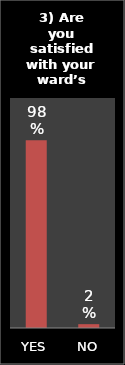
| Category | Series 0 |
|---|---|
| YES | 0.98 |
| NO | 0.02 |